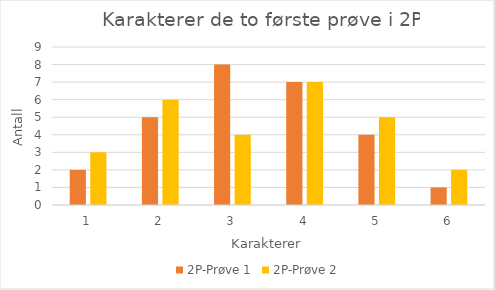
| Category | 2P-Prøve 1 | 2P-Prøve 2 |
|---|---|---|
| 1.0 | 2 | 3 |
| 2.0 | 5 | 6 |
| 3.0 | 8 | 4 |
| 4.0 | 7 | 7 |
| 5.0 | 4 | 5 |
| 6.0 | 1 | 2 |